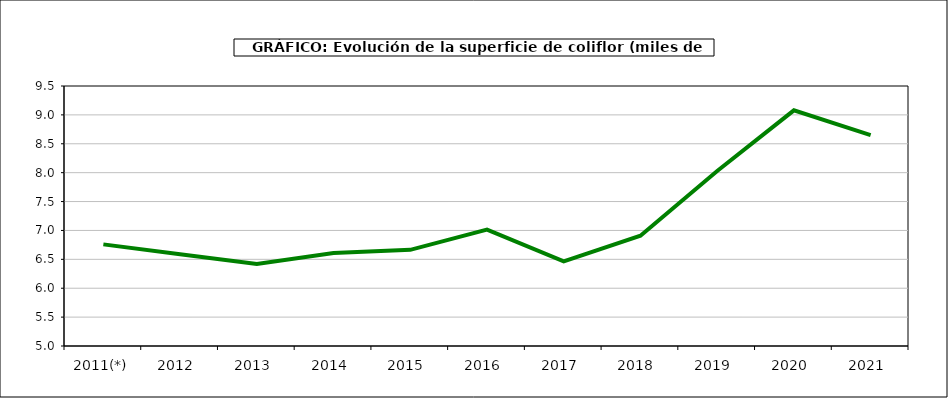
| Category | superficie |
|---|---|
| 2011(*) | 6.759 |
| 2012  | 6.587 |
| 2013  | 6.418 |
| 2014  | 6.61 |
| 2015  | 6.664 |
| 2016  | 7.014 |
| 2017  | 6.465 |
| 2018  | 6.909 |
| 2019  | 8.03 |
| 2020  | 9.079 |
| 2021  | 8.651 |